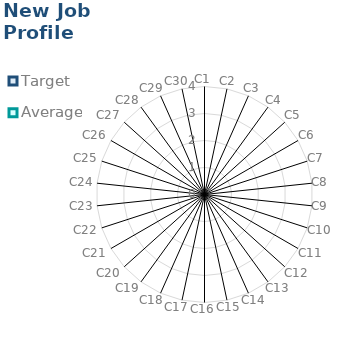
| Category | Target | Average |
|---|---|---|
| C1 | 0 | 0 |
| C2 | 0 | 0 |
| C3 | 0 | 0 |
| C4 | 0 | 0 |
| C5 | 0 | 0 |
| C6 | 0 | 0 |
| C7 | 0 | 0 |
| C8 | 0 | 0 |
| C9 | 0 | 0 |
| C10 | 0 | 0 |
| C11 | 0 | 0 |
| C12 | 0 | 0 |
| C13 | 0 | 0 |
| C14 | 0 | 0 |
| C15 | 0 | 0 |
| C16 | 0 | 0 |
| C17 | 0 | 0 |
| C18 | 0 | 0 |
| C19 | 0 | 0 |
| C20 | 0 | 0 |
| C21 | 0 | 0 |
| C22 | 0 | 0 |
| C23 | 0 | 0 |
| C24 | 0 | 0 |
| C25 | 0 | 0 |
| C26 | 0 | 0 |
| C27 | 0 | 0 |
| C28 | 0 | 0 |
| C29 | 0 | 0 |
| C30 | 0 | 0 |